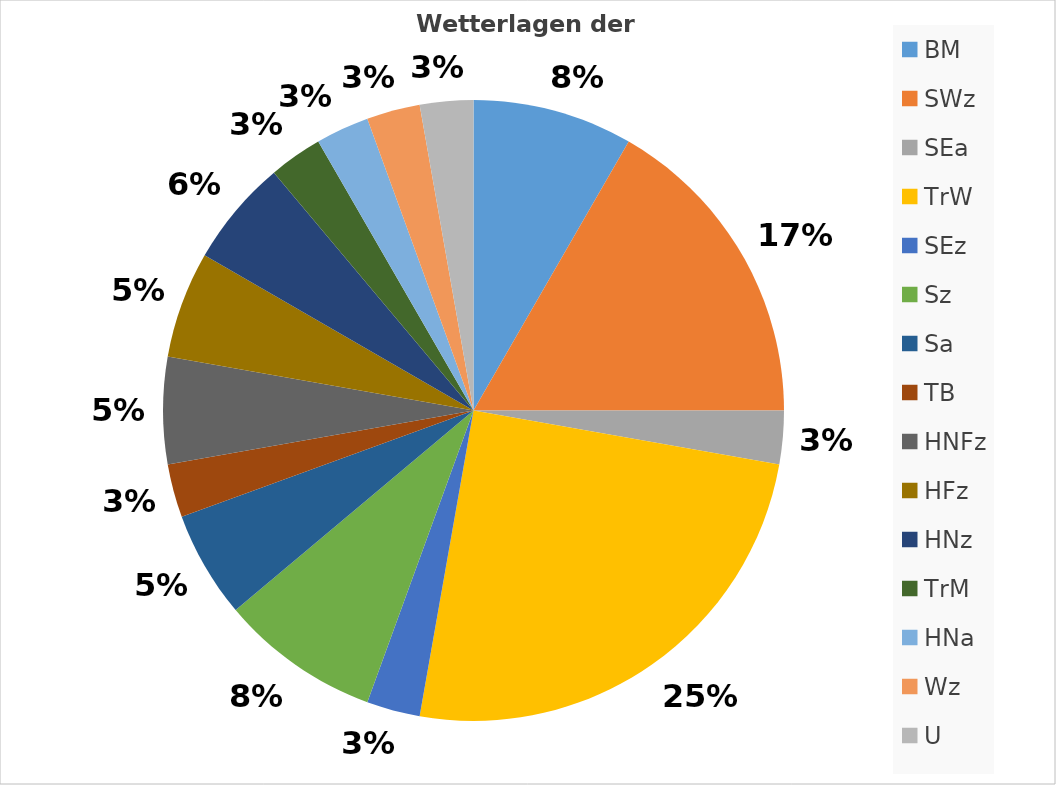
| Category | Series 0 |
|---|---|
| BM | 3 |
| SWz | 6 |
| SEa | 1 |
| TrW | 9 |
| SEz | 1 |
| Sz | 3 |
| Sa | 2 |
| TB | 1 |
| HNFz | 2 |
| HFz | 2 |
| HNz | 2 |
| TrM | 1 |
| HNa | 1 |
| Wz | 1 |
| U | 1 |